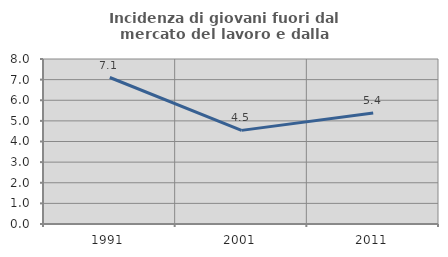
| Category | Incidenza di giovani fuori dal mercato del lavoro e dalla formazione  |
|---|---|
| 1991.0 | 7.102 |
| 2001.0 | 4.54 |
| 2011.0 | 5.378 |